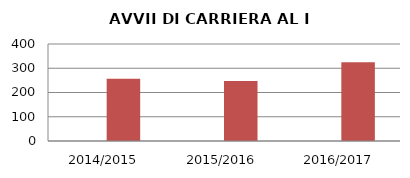
| Category | ANNO | NUMERO |
|---|---|---|
| 2014/2015 | 0 | 257 |
| 2015/2016 | 0 | 247 |
| 2016/2017 | 0 | 325 |